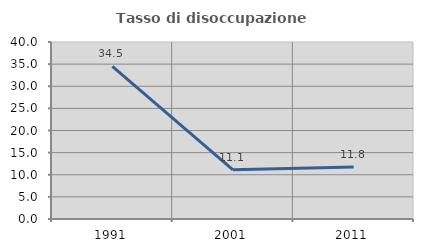
| Category | Tasso di disoccupazione giovanile  |
|---|---|
| 1991.0 | 34.483 |
| 2001.0 | 11.111 |
| 2011.0 | 11.765 |